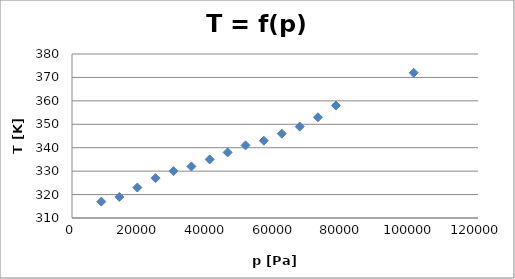
| Category | Series 0 |
|---|---|
| 8670.0 | 317 |
| 14000.0 | 319 |
| 19300.0 | 323 |
| 24700.0 | 327 |
| 30000.0 | 330 |
| 35300.0 | 332 |
| 40700.0 | 335 |
| 46000.0 | 338 |
| 51300.0 | 341 |
| 56700.0 | 343 |
| 62000.0 | 346 |
| 67300.0 | 349 |
| 72700.0 | 353 |
| 78000.0 | 358 |
| 101000.0 | 372 |